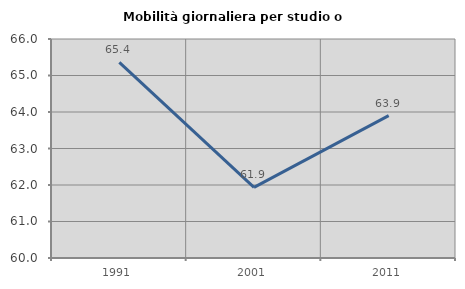
| Category | Mobilità giornaliera per studio o lavoro |
|---|---|
| 1991.0 | 65.359 |
| 2001.0 | 61.937 |
| 2011.0 | 63.9 |